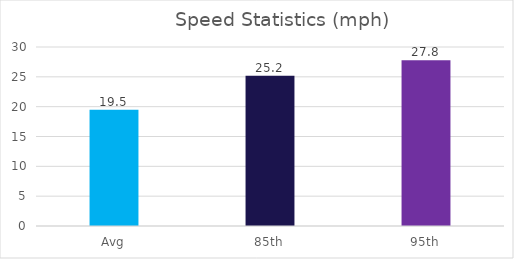
| Category | Series 0 |
|---|---|
| Avg | 19.5 |
| 85th | 25.2 |
| 95th | 27.8 |